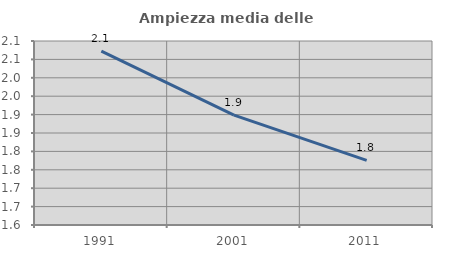
| Category | Ampiezza media delle famiglie |
|---|---|
| 1991.0 | 2.072 |
| 2001.0 | 1.899 |
| 2011.0 | 1.776 |